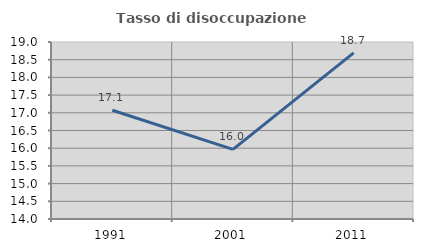
| Category | Tasso di disoccupazione giovanile  |
|---|---|
| 1991.0 | 17.073 |
| 2001.0 | 15.966 |
| 2011.0 | 18.692 |